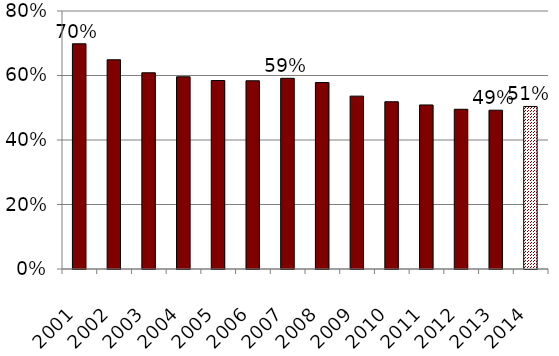
| Category | Series 0 |
|---|---|
| 2001.0 | 0.698 |
| 2002.0 | 0.649 |
| 2003.0 | 0.608 |
| 2004.0 | 0.596 |
| 2005.0 | 0.584 |
| 2006.0 | 0.584 |
| 2007.0 | 0.591 |
| 2008.0 | 0.578 |
| 2009.0 | 0.536 |
| 2010.0 | 0.519 |
| 2011.0 | 0.509 |
| 2012.0 | 0.495 |
| 2013.0 | 0.492 |
| 2014.0 | 0.504 |